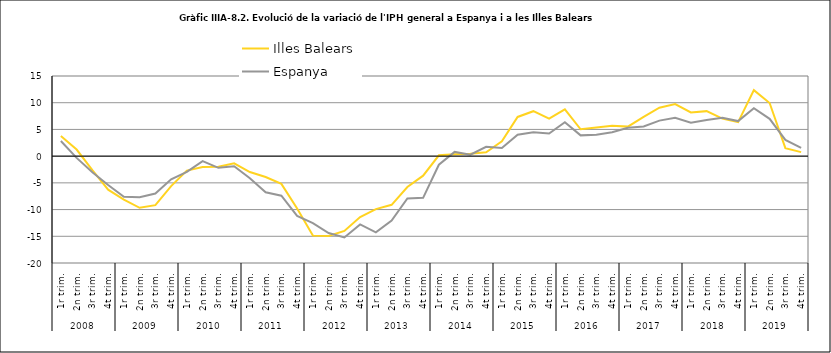
| Category | Illes Balears | Espanya |
|---|---|---|
| 0 | 3.758 | 2.842 |
| 1 | 1.234 | -0.323 |
| 2 | -2.626 | -3.022 |
| 3 | -6.275 | -5.396 |
| 4 | -8.136 | -7.589 |
| 5 | -9.67 | -7.71 |
| 6 | -9.173 | -6.993 |
| 7 | -5.603 | -4.349 |
| 8 | -2.712 | -2.932 |
| 9 | -2.021 | -0.936 |
| 10 | -1.974 | -2.192 |
| 11 | -1.348 | -1.904 |
| 12 | -2.975 | -4.135 |
| 13 | -3.898 | -6.771 |
| 14 | -5.192 | -7.395 |
| 15 | -9.799 | -11.17 |
| 16 | -14.849 | -12.551 |
| 17 | -14.951 | -14.382 |
| 18 | -13.992 | -15.228 |
| 19 | -11.39 | -12.787 |
| 20 | -9.906 | -14.259 |
| 21 | -9.107 | -12.04 |
| 22 | -5.779 | -7.929 |
| 23 | -3.652 | -7.801 |
| 24 | 0.164 | -1.612 |
| 25 | 0.371 | 0.795 |
| 26 | 0.466 | 0.269 |
| 27 | 0.73 | 1.761 |
| 28 | 2.783 | 1.516 |
| 29 | 7.336 | 4.01 |
| 30 | 8.411 | 4.491 |
| 31 | 7.002 | 4.23 |
| 32 | 8.772 | 6.336 |
| 33 | 5.025 | 3.887 |
| 34 | 5.353 | 4.018 |
| 35 | 5.7 | 4.484 |
| 36 | 5.525 | 5.316 |
| 37 | 7.366 | 5.553 |
| 38 | 9.073 | 6.65 |
| 39 | 9.757 | 7.189 |
| 40 | 8.19 | 6.237 |
| 41 | 8.424 | 6.784 |
| 42 | 7.029 | 7.166 |
| 43 | 6.376 | 6.56 |
| 44 | 12.354 | 8.983 |
| 45 | 9.951 | 6.985 |
| 46 | 1.489 | 3.05 |
| 47 | 0.752 | 1.537 |